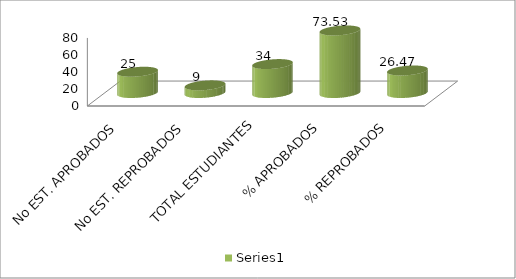
| Category | Series 0 |
|---|---|
| No EST. APROBADOS | 25 |
| No EST. REPROBADOS | 9 |
| TOTAL ESTUDIANTES | 34 |
| % APROBADOS | 73.529 |
| % REPROBADOS | 26.471 |